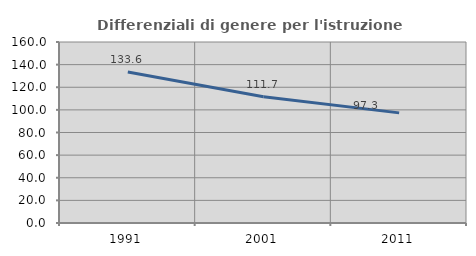
| Category | Differenziali di genere per l'istruzione superiore |
|---|---|
| 1991.0 | 133.565 |
| 2001.0 | 111.656 |
| 2011.0 | 97.347 |